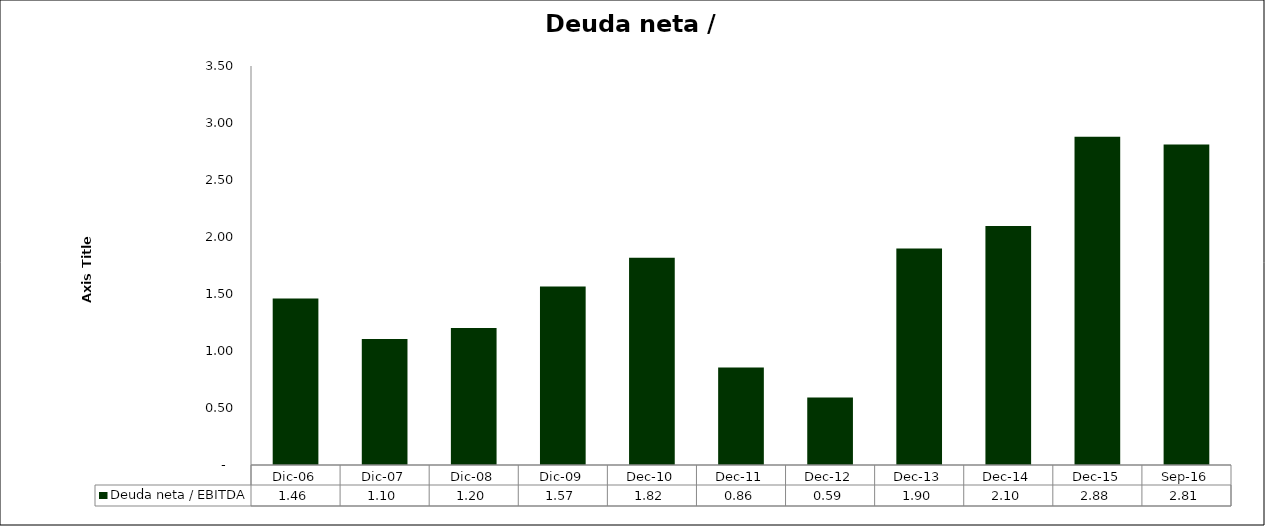
| Category | Deuda neta / EBITDA |
|---|---|
| Dic-06 | 1.461 |
| Dic-07 | 1.104 |
| Dic-08 | 1.202 |
| Dic-09 | 1.565 |
| dic-10 | 1.817 |
| dic-11 | 0.856 |
| dic-12 | 0.593 |
| dic-13 | 1.899 |
| dic-14 | 2.097 |
| dic-15 | 2.879 |
| Sep-16 | 2.811 |